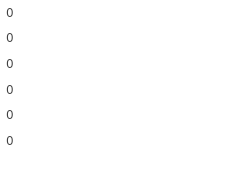
| Category | Series 0 | Series 1 |
|---|---|---|
| 0 | 77 | -8 |
| 1 | 87 | -9 |
| 2 | 65 | -7 |
| 3 | 84 | -15 |
| 4 | 84 | -7 |
| 5 | 75 | -9 |